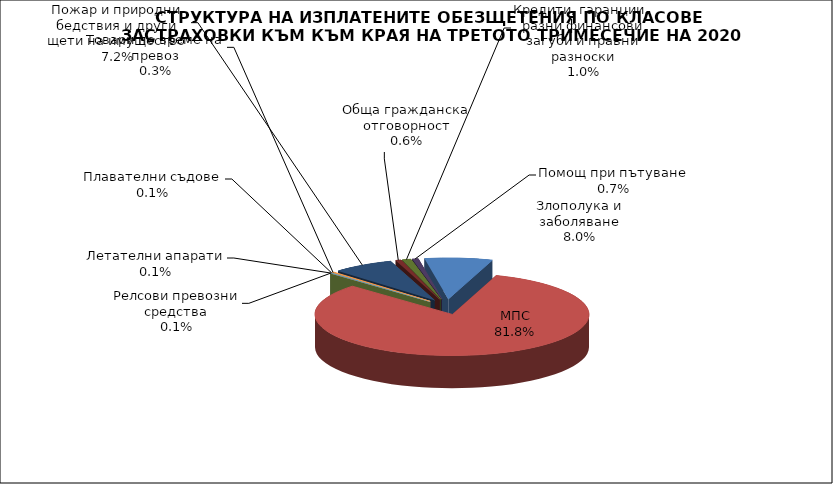
| Category | Злополука и заболяване |
|---|---|
| Злополука и заболяване | 0.08 |
| МПС | 0.818 |
| Релсови превозни средства | 0.001 |
| Летателни апарати | 0.001 |
| Плавателни съдове | 0.001 |
| Товари по време на превоз | 0.003 |
| Пожар и природни бедствия и други щети на имущество | 0.072 |
| Обща гражданска отговорност | 0.006 |
| Кредити, гаранции, разни финансови загуби и правни разноски | 0.01 |
| Помощ при пътуване | 0.007 |